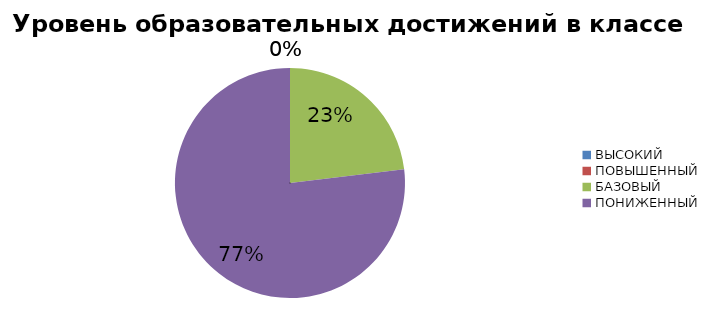
| Category | Series 0 |
|---|---|
| ВЫСОКИЙ | 0 |
| ПОВЫШЕННЫЙ | 0 |
| БАЗОВЫЙ | 16.667 |
| ПОНИЖЕННЫЙ | 55.556 |